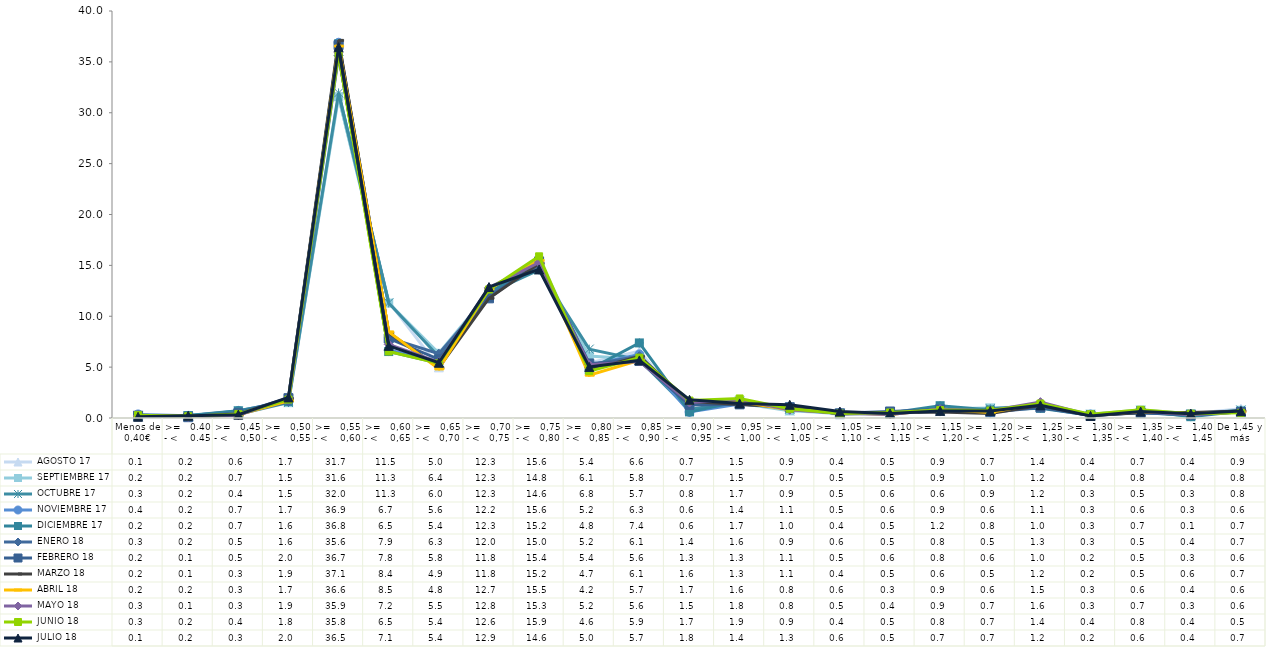
| Category |  AGOSTO 17 |  SEPTIEMBRE 17 |  OCTUBRE 17 |  NOVIEMBRE 17 |  DICIEMBRE 17 |  ENERO 18 |  FEBRERO 18 |  MARZO 18 |  ABRIL 18 |  MAYO 18 |  JUNIO 18 |  JULIO 18 |
|---|---|---|---|---|---|---|---|---|---|---|---|---|
| Menos de 0,40€ | 0.12 | 0.18 | 0.25 | 0.35 | 0.16 | 0.27 | 0.23 | 0.24 | 0.2 | 0.25 | 0.28 | 0.12 |
| >=   0.40 - <    0.45 | 0.17 | 0.21 | 0.22 | 0.21 | 0.24 | 0.17 | 0.08 | 0.1 | 0.16 | 0.11 | 0.17 | 0.22 |
| >=   0,45 - <    0,50 | 0.62 | 0.67 | 0.37 | 0.7 | 0.71 | 0.47 | 0.47 | 0.33 | 0.32 | 0.28 | 0.4 | 0.33 |
| >=   0,50 - <    0,55 | 1.67 | 1.51 | 1.53 | 1.68 | 1.63 | 1.59 | 1.95 | 1.9 | 1.69 | 1.94 | 1.81 | 2.02 |
| >=   0,55 - <    0,60 | 31.74 | 31.58 | 31.95 | 36.88 | 36.78 | 35.62 | 36.65 | 37.11 | 36.55 | 35.9 | 35.81 | 36.45 |
| >=   0,60 - <    0,65 | 11.45 | 11.29 | 11.31 | 6.69 | 6.53 | 7.87 | 7.82 | 8.37 | 8.46 | 7.24 | 6.54 | 7.09 |
| >=   0,65 - <   0,70 | 4.98 | 6.36 | 6.02 | 5.56 | 5.41 | 6.32 | 5.77 | 4.94 | 4.82 | 5.48 | 5.37 | 5.43 |
| >=   0,70 - <   0,75 | 12.26 | 12.3 | 12.29 | 12.24 | 12.31 | 12 | 11.76 | 11.77 | 12.66 | 12.8 | 12.63 | 12.87 |
| >=   0,75 - <   0,80 | 15.63 | 14.82 | 14.55 | 15.56 | 15.2 | 14.99 | 15.39 | 15.19 | 15.48 | 15.29 | 15.89 | 14.6 |
| >=   0,80 - <   0,85 | 5.41 | 6.09 | 6.77 | 5.19 | 4.77 | 5.21 | 5.36 | 4.73 | 4.21 | 5.24 | 4.61 | 5.02 |
| >=   0,85 - <   0,90 | 6.57 | 5.78 | 5.71 | 6.25 | 7.38 | 6.08 | 5.62 | 6.06 | 5.68 | 5.56 | 5.93 | 5.66 |
| >=   0,90 - <    0,95 | 0.72 | 0.74 | 0.83 | 0.6 | 0.6 | 1.37 | 1.29 | 1.62 | 1.67 | 1.52 | 1.71 | 1.79 |
| >=   0,95 - <   1,00 | 1.54 | 1.46 | 1.65 | 1.38 | 1.65 | 1.56 | 1.34 | 1.33 | 1.6 | 1.79 | 1.92 | 1.43 |
| >=   1,00 - <   1,05 | 0.89 | 0.7 | 0.87 | 1.09 | 0.95 | 0.9 | 1.06 | 1.09 | 0.82 | 0.81 | 0.91 | 1.3 |
| >=   1,05 - <    1,10 | 0.35 | 0.46 | 0.46 | 0.48 | 0.44 | 0.57 | 0.46 | 0.4 | 0.55 | 0.46 | 0.44 | 0.63 |
| >=   1,10 - <   1,15 | 0.46 | 0.49 | 0.55 | 0.56 | 0.49 | 0.51 | 0.64 | 0.52 | 0.34 | 0.35 | 0.54 | 0.45 |
| >=   1,15 - <    1,20 | 0.88 | 0.91 | 0.63 | 0.91 | 1.21 | 0.8 | 0.83 | 0.6 | 0.85 | 0.86 | 0.78 | 0.7 |
| >=   1,20 - <    1,25 | 0.68 | 0.99 | 0.91 | 0.64 | 0.79 | 0.52 | 0.57 | 0.45 | 0.55 | 0.71 | 0.73 | 0.69 |
| >=   1,25 - <    1,30 | 1.44 | 1.15 | 1.23 | 1.14 | 0.95 | 1.3 | 1.04 | 1.23 | 1.47 | 1.56 | 1.42 | 1.24 |
| >=   1,30 - <    1,35 | 0.36 | 0.38 | 0.33 | 0.34 | 0.28 | 0.3 | 0.24 | 0.21 | 0.26 | 0.28 | 0.37 | 0.2 |
| >=   1,35 - <    1,40 | 0.71 | 0.78 | 0.53 | 0.6 | 0.74 | 0.51 | 0.51 | 0.54 | 0.64 | 0.67 | 0.81 | 0.63 |
| >=   1,40 - <    1,45 | 0.41 | 0.41 | 0.25 | 0.32 | 0.13 | 0.37 | 0.32 | 0.55 | 0.42 | 0.31 | 0.42 | 0.43 |
| De 1,45 y más | 0.91 | 0.76 | 0.78 | 0.63 | 0.66 | 0.68 | 0.59 | 0.7 | 0.59 | 0.59 | 0.51 | 0.68 |